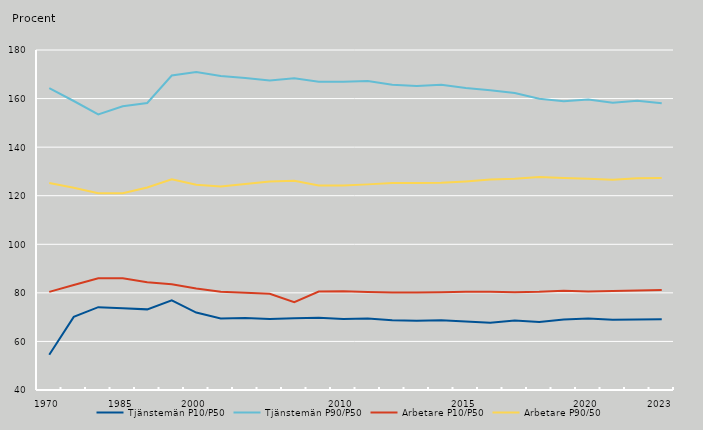
| Category | Tjänstemän P10/P50 | Tjänstemän P90/P50 | Arbetare P10/P50 | Arbetare P90/50 |
|---|---|---|---|---|
| 1970.0 | 54.5 | 164.3 | 80.4 | 125.2 |
| nan | 70.1 | 159 | 83.2 | 123.3 |
| nan | 74.1 | 153.5 | 86 | 121 |
| 1985.0 | 73.7 | 156.8 | 86 | 121 |
| nan | 73.2 | 158.2 | 84.4 | 123.4 |
| nan | 76.9 | 169.5 | 83.5 | 126.8 |
| 2000.0 | 71.9 | 170.9 | 81.8 | 124.5 |
| nan | 69.492 | 169.272 | 80.472 | 123.792 |
| nan | 69.6 | 168.5 | 80 | 124.8 |
| nan | 69.196 | 167.45 | 79.625 | 125.835 |
| nan | 69.5 | 168.4 | 76.2 | 126.2 |
| nan | 69.768 | 166.936 | 80.568 | 124.163 |
| 2010.0 | 69.227 | 166.88 | 80.695 | 124.156 |
| nan | 69.41 | 167.253 | 80.381 | 124.669 |
| nan | 68.765 | 165.661 | 80.182 | 125.198 |
| nan | 68.526 | 165.228 | 80.171 | 125.189 |
| nan | 68.747 | 165.734 | 80.265 | 125.293 |
| 2015.0 | 68.233 | 164.312 | 80.449 | 125.901 |
| nan | 67.683 | 163.462 | 80.47 | 126.713 |
| nan | 68.645 | 162.333 | 80.275 | 126.949 |
| nan | 68.033 | 159.922 | 80.435 | 127.693 |
| nan | 69.034 | 158.856 | 80.86 | 127.327 |
| 2020.0 | 69.404 | 159.653 | 80.546 | 127.015 |
| nan | 68.933 | 158.258 | 80.807 | 126.601 |
| nan | 69.054 | 159.054 | 81.017 | 127.196 |
| 2023.0 | 69.136 | 158.067 | 81.127 | 127.248 |